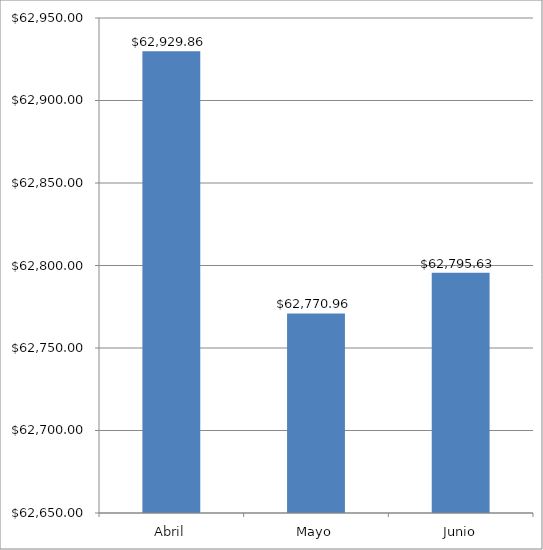
| Category | Series 0 |
|---|---|
| Abril | 62929.86 |
| Mayo | 62770.96 |
| Junio | 62795.63 |